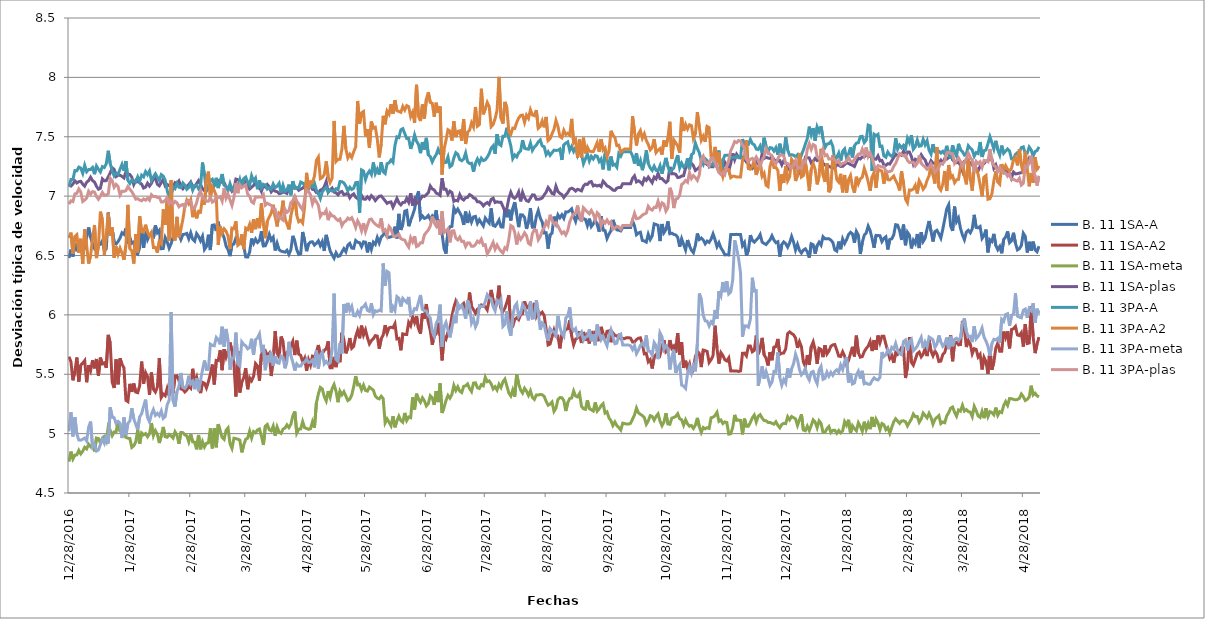
| Category | B. 11 1SA-A | B. 11 1SA-A2 | B. 11 1SA-meta | B. 11 1SA-plas | B. 11 3PA-A | B. 11 3PA-A2 | B. 11 3PA-meta | B. 11 3PA-plas |
|---|---|---|---|---|---|---|---|---|
| 28/12/2016 | 6.479 | 5.648 | 4.764 | 7.093 | 7.08 | 6.648 | 5.019 | 6.933 |
| 29/12/2016 | 6.55 | 5.605 | 4.849 | 7.085 | 7.141 | 6.693 | 5.18 | 6.96 |
| 30/12/2016 | 6.491 | 5.449 | 4.786 | 7.102 | 7.14 | 6.517 | 4.976 | 6.954 |
| 31/12/2016 | 6.603 | 5.524 | 4.819 | 7.129 | 7.215 | 6.66 | 5.138 | 7.018 |
| 01/01/2017 | 6.546 | 5.64 | 4.821 | 7.111 | 7.213 | 6.675 | 4.998 | 7.024 |
| 02/01/2017 | 6.548 | 5.438 | 4.859 | 7.122 | 7.244 | 6.522 | 4.946 | 7.061 |
| 03/01/2017 | 6.562 | 5.577 | 4.829 | 7.125 | 7.237 | 6.641 | 4.945 | 7.034 |
| 04/01/2017 | 6.517 | 5.594 | 4.851 | 7.101 | 7.192 | 6.432 | 4.953 | 6.955 |
| 05/01/2017 | 6.567 | 5.615 | 4.885 | 7.084 | 7.259 | 6.72 | 4.962 | 6.967 |
| 06/01/2017 | 6.652 | 5.433 | 4.871 | 7.117 | 7.205 | 6.584 | 4.937 | 6.983 |
| 07/01/2017 | 6.736 | 5.576 | 4.911 | 7.131 | 7.223 | 6.432 | 5.053 | 7.041 |
| 08/01/2017 | 6.655 | 5.531 | 4.89 | 7.159 | 7.224 | 6.5 | 5.101 | 7.017 |
| 09/01/2017 | 6.597 | 5.618 | 4.909 | 7.131 | 7.241 | 6.642 | 4.888 | 7.038 |
| 10/01/2017 | 6.559 | 5.55 | 4.85 | 7.119 | 7.185 | 6.757 | 4.907 | 7.034 |
| 11/01/2017 | 6.579 | 5.629 | 4.963 | 7.083 | 7.254 | 6.479 | 4.853 | 6.997 |
| 12/01/2017 | 6.588 | 5.488 | 4.959 | 7.058 | 7.226 | 6.579 | 4.863 | 6.973 |
| 13/01/2017 | 6.595 | 5.64 | 4.921 | 7.067 | 7.203 | 6.869 | 4.909 | 6.999 |
| 14/01/2017 | 6.624 | 5.587 | 4.961 | 7.145 | 7.249 | 6.801 | 4.954 | 7.032 |
| 15/01/2017 | 6.538 | 5.596 | 4.976 | 7.128 | 7.241 | 6.505 | 4.919 | 7.006 |
| 16/01/2017 | 6.558 | 5.554 | 4.939 | 7.131 | 7.272 | 6.674 | 4.984 | 7.01 |
| 17/01/2017 | 6.861 | 5.831 | 5.059 | 7.163 | 7.382 | 6.855 | 4.918 | 7.017 |
| 18/01/2017 | 6.676 | 5.761 | 5.028 | 7.194 | 7.273 | 6.665 | 5.221 | 7.151 |
| 19/01/2017 | 6.722 | 5.432 | 4.983 | 7.239 | 7.215 | 6.737 | 5.138 | 7.131 |
| 20/01/2017 | 6.613 | 5.385 | 5.015 | 7.225 | 7.171 | 6.481 | 5.134 | 7.075 |
| 21/01/2017 | 6.598 | 5.625 | 5.015 | 7.165 | 7.196 | 6.576 | 5.085 | 7.099 |
| 22/01/2017 | 6.617 | 5.415 | 5.102 | 7.176 | 7.184 | 6.511 | 5.103 | 7.081 |
| 23/01/2017 | 6.647 | 5.634 | 5.021 | 7.176 | 7.227 | 6.562 | 5.088 | 7.01 |
| 24/01/2017 | 6.691 | 5.584 | 5.022 | 7.166 | 7.267 | 6.52 | 4.963 | 7.04 |
| 25/01/2017 | 6.678 | 5.553 | 5 | 7.153 | 7.213 | 6.463 | 5.136 | 7.04 |
| 26/01/2017 | 6.728 | 5.28 | 4.968 | 7.206 | 7.295 | 6.587 | 4.986 | 7.047 |
| 27/01/2017 | 6.596 | 5.269 | 4.962 | 7.186 | 7.133 | 6.926 | 5.087 | 7.08 |
| 28/01/2017 | 6.653 | 5.419 | 4.959 | 7.182 | 7.107 | 6.558 | 5.106 | 7.058 |
| 29/01/2017 | 6.604 | 5.351 | 4.884 | 7.159 | 7.135 | 6.54 | 5.214 | 7.037 |
| 30/01/2017 | 6.614 | 5.422 | 4.898 | 7.098 | 7.121 | 6.432 | 5.125 | 7.009 |
| 31/01/2017 | 6.522 | 5.35 | 4.929 | 7.133 | 7.118 | 6.679 | 5.079 | 6.974 |
| 01/02/2017 | 6.511 | 5.345 | 5.029 | 7.122 | 7.162 | 6.525 | 5.032 | 6.979 |
| 02/02/2017 | 6.567 | 5.404 | 4.913 | 7.113 | 7.124 | 6.831 | 5.141 | 6.968 |
| 03/02/2017 | 6.728 | 5.606 | 5.006 | 7.101 | 7.177 | 6.7 | 5.167 | 6.961 |
| 04/02/2017 | 6.565 | 5.421 | 4.99 | 7.068 | 7.162 | 6.696 | 5.229 | 6.976 |
| 05/02/2017 | 6.706 | 5.514 | 5.001 | 7.076 | 7.207 | 6.759 | 5.287 | 6.966 |
| 06/02/2017 | 6.634 | 5.478 | 4.973 | 7.109 | 7.18 | 6.697 | 5.136 | 6.983 |
| 07/02/2017 | 6.669 | 5.327 | 4.999 | 7.085 | 7.212 | 6.665 | 5.1 | 6.966 |
| 08/02/2017 | 6.691 | 5.514 | 5.089 | 7.108 | 7.131 | 6.694 | 5.164 | 7.012 |
| 09/02/2017 | 6.645 | 5.375 | 4.983 | 7.145 | 7.162 | 6.567 | 5.203 | 6.996 |
| 10/02/2017 | 6.753 | 5.35 | 5.025 | 7.152 | 7.188 | 6.568 | 5.154 | 6.998 |
| 11/02/2017 | 6.692 | 5.391 | 4.994 | 7.1 | 7.159 | 6.523 | 5.171 | 6.988 |
| 12/02/2017 | 6.713 | 5.636 | 4.92 | 7.087 | 7.132 | 6.62 | 5.15 | 6.99 |
| 13/02/2017 | 6.557 | 5.305 | 4.982 | 7.113 | 7.181 | 6.599 | 5.192 | 6.951 |
| 14/02/2017 | 6.559 | 5.333 | 5.056 | 7.143 | 7.169 | 6.889 | 5.129 | 6.951 |
| 15/02/2017 | 6.651 | 5.319 | 4.974 | 7.086 | 7.133 | 6.757 | 5.144 | 6.965 |
| 16/02/2017 | 6.615 | 5.38 | 4.969 | 7.098 | 7.048 | 6.971 | 5.243 | 6.988 |
| 17/02/2017 | 6.562 | 5.319 | 4.993 | 7.089 | 6.983 | 6.622 | 5.28 | 6.936 |
| 18/02/2017 | 6.6 | 5.41 | 4.981 | 7.091 | 6.984 | 7.135 | 6.025 | 6.954 |
| 19/02/2017 | 6.656 | 5.34 | 4.963 | 7.066 | 7.08 | 6.664 | 5.278 | 6.935 |
| 20/02/2017 | 6.694 | 5.486 | 5.016 | 7.114 | 7.064 | 6.626 | 5.227 | 6.956 |
| 21/02/2017 | 6.76 | 5.487 | 4.987 | 7.107 | 7.107 | 6.825 | 5.356 | 6.944 |
| 22/02/2017 | 6.677 | 5.447 | 4.914 | 7.128 | 7.075 | 6.653 | 5.397 | 6.91 |
| 23/02/2017 | 6.634 | 5.376 | 5.009 | 7.083 | 7.071 | 6.721 | 5.511 | 6.924 |
| 24/02/2017 | 6.677 | 5.372 | 5.008 | 7.062 | 7.111 | 6.803 | 5.39 | 6.929 |
| 25/02/2017 | 6.679 | 5.351 | 4.99 | 7.084 | 7.092 | 6.91 | 5.381 | 6.904 |
| 26/02/2017 | 6.686 | 5.367 | 4.982 | 7.082 | 7.057 | 6.966 | 5.404 | 6.955 |
| 27/02/2017 | 6.641 | 5.397 | 4.931 | 7.097 | 7.072 | 6.935 | 5.488 | 6.965 |
| 28/02/2017 | 6.691 | 5.382 | 4.995 | 7.119 | 7.109 | 6.97 | 5.418 | 6.956 |
| 01/03/2017 | 6.637 | 5.546 | 4.931 | 7.083 | 7.05 | 6.823 | 5.44 | 6.895 |
| 02/03/2017 | 6.62 | 5.432 | 4.928 | 7.078 | 7.09 | 6.878 | 5.374 | 6.901 |
| 03/03/2017 | 6.685 | 5.475 | 4.867 | 7.106 | 7.094 | 6.812 | 5.467 | 6.944 |
| 04/03/2017 | 6.661 | 5.391 | 4.989 | 7.131 | 7.061 | 6.872 | 5.358 | 7.009 |
| 05/03/2017 | 6.624 | 5.341 | 4.868 | 7.096 | 7.082 | 6.865 | 5.448 | 7.043 |
| 06/03/2017 | 6.662 | 5.432 | 4.932 | 7.064 | 7.283 | 6.995 | 5.537 | 6.982 |
| 07/03/2017 | 6.551 | 5.424 | 4.887 | 7.045 | 7.179 | 6.929 | 5.616 | 6.978 |
| 08/03/2017 | 6.575 | 5.385 | 4.919 | 7.082 | 7.042 | 7.145 | 5.54 | 6.957 |
| 09/03/2017 | 6.675 | 5.437 | 4.922 | 7.085 | 7.069 | 7.206 | 5.54 | 6.957 |
| 10/03/2017 | 6.546 | 5.502 | 5.044 | 7.094 | 7.133 | 6.99 | 5.754 | 6.991 |
| 11/03/2017 | 6.755 | 5.582 | 4.876 | 7.071 | 7.143 | 7.077 | 5.743 | 6.949 |
| 12/03/2017 | 6.758 | 5.414 | 5.046 | 7.089 | 7.096 | 7.046 | 5.74 | 6.959 |
| 13/03/2017 | 6.707 | 5.617 | 4.885 | 7.12 | 7.154 | 7.002 | 5.81 | 6.995 |
| 14/03/2017 | 6.785 | 5.615 | 5.08 | 7.132 | 7.068 | 6.589 | 5.792 | 6.988 |
| 15/03/2017 | 6.681 | 5.702 | 5.023 | 7.123 | 7.127 | 6.746 | 5.752 | 6.996 |
| 16/03/2017 | 6.693 | 5.534 | 4.968 | 7.116 | 7.186 | 6.686 | 5.9 | 6.958 |
| 17/03/2017 | 6.65 | 5.711 | 4.951 | 7.115 | 7.093 | 6.725 | 5.731 | 7.068 |
| 18/03/2017 | 6.58 | 5.645 | 5.028 | 7.079 | 7.079 | 6.705 | 5.882 | 6.981 |
| 19/03/2017 | 6.548 | 5.696 | 5.048 | 7.073 | 7.045 | 6.664 | 5.78 | 7.015 |
| 20/03/2017 | 6.495 | 5.767 | 4.915 | 7.071 | 7.105 | 6.556 | 5.538 | 6.967 |
| 21/03/2017 | 6.593 | 5.699 | 4.876 | 7.04 | 7.055 | 6.731 | 5.631 | 6.921 |
| 22/03/2017 | 6.597 | 5.585 | 4.961 | 7.057 | 7.079 | 6.726 | 5.641 | 6.989 |
| 23/03/2017 | 6.648 | 5.313 | 4.958 | 7.144 | 7.095 | 6.788 | 5.851 | 7.111 |
| 24/03/2017 | 6.637 | 5.693 | 4.953 | 7.138 | 7.087 | 6.586 | 5.588 | 7.025 |
| 25/03/2017 | 6.608 | 5.347 | 4.945 | 7.13 | 7.14 | 6.6 | 5.57 | 7.095 |
| 26/03/2017 | 6.607 | 5.433 | 4.842 | 7.128 | 7.07 | 6.678 | 5.773 | 7.071 |
| 27/03/2017 | 6.579 | 5.471 | 4.904 | 7.109 | 7.147 | 6.553 | 5.75 | 7.083 |
| 28/03/2017 | 6.489 | 5.552 | 4.953 | 7.125 | 7.161 | 6.73 | 5.74 | 7.094 |
| 29/03/2017 | 6.487 | 5.374 | 4.962 | 7.089 | 7.12 | 6.718 | 5.714 | 7.016 |
| 30/03/2017 | 6.528 | 5.469 | 5.021 | 7.06 | 7.092 | 6.762 | 5.725 | 7 |
| 31/03/2017 | 6.643 | 5.446 | 4.963 | 7.075 | 7.172 | 6.691 | 5.799 | 6.953 |
| 01/04/2017 | 6.601 | 5.484 | 5.018 | 7.09 | 7.126 | 6.806 | 5.663 | 6.94 |
| 02/04/2017 | 6.638 | 5.59 | 5.007 | 7.111 | 7.152 | 6.722 | 5.79 | 6.994 |
| 03/04/2017 | 6.61 | 5.57 | 5.031 | 7.08 | 7.058 | 6.814 | 5.806 | 6.991 |
| 04/04/2017 | 6.625 | 5.446 | 5.039 | 7.076 | 7.133 | 6.731 | 5.84 | 6.993 |
| 05/04/2017 | 6.704 | 5.669 | 4.98 | 7.04 | 7.07 | 6.94 | 5.713 | 6.992 |
| 06/04/2017 | 6.58 | 5.688 | 4.904 | 7.094 | 7.096 | 6.762 | 5.747 | 7.012 |
| 07/04/2017 | 6.582 | 5.697 | 5.063 | 7.076 | 7.096 | 6.645 | 5.534 | 6.924 |
| 08/04/2017 | 6.621 | 5.656 | 5.077 | 7.098 | 7.059 | 6.788 | 5.657 | 6.94 |
| 09/04/2017 | 6.677 | 5.677 | 5.032 | 7.078 | 7.07 | 6.824 | 5.6 | 6.93 |
| 10/04/2017 | 6.63 | 5.485 | 5.023 | 7.035 | 7.058 | 6.857 | 5.689 | 6.922 |
| 11/04/2017 | 6.654 | 5.645 | 5.064 | 7.055 | 7.103 | 6.927 | 5.572 | 6.895 |
| 12/04/2017 | 6.542 | 5.863 | 4.982 | 7.042 | 7.071 | 6.827 | 5.651 | 6.89 |
| 13/04/2017 | 6.604 | 5.678 | 5.056 | 7.037 | 7.084 | 6.745 | 5.598 | 6.817 |
| 14/04/2017 | 6.549 | 5.646 | 5.014 | 7.021 | 7.108 | 6.857 | 5.593 | 6.834 |
| 15/04/2017 | 6.537 | 5.818 | 5.003 | 7.024 | 7.027 | 6.845 | 5.654 | 6.811 |
| 16/04/2017 | 6.533 | 5.776 | 5.037 | 7.034 | 7.091 | 6.962 | 5.642 | 6.798 |
| 17/04/2017 | 6.528 | 5.613 | 5.047 | 7.03 | 7.039 | 6.81 | 5.55 | 6.889 |
| 18/04/2017 | 6.544 | 5.683 | 5.074 | 7.023 | 7.05 | 6.767 | 5.609 | 6.864 |
| 19/04/2017 | 6.509 | 5.694 | 5.051 | 7.07 | 7.097 | 6.72 | 5.774 | 6.877 |
| 20/04/2017 | 6.548 | 5.74 | 5.078 | 7.066 | 7.007 | 6.835 | 5.658 | 6.946 |
| 21/04/2017 | 6.665 | 5.778 | 5.149 | 7.097 | 7.126 | 6.906 | 5.601 | 6.963 |
| 22/04/2017 | 6.62 | 5.662 | 5.187 | 7.066 | 7.067 | 7.004 | 5.531 | 6.999 |
| 23/04/2017 | 6.549 | 5.783 | 5.004 | 7.07 | 7.073 | 6.839 | 5.587 | 6.958 |
| 24/04/2017 | 6.509 | 5.67 | 5.037 | 7.049 | 7.067 | 6.784 | 5.568 | 6.936 |
| 25/04/2017 | 6.515 | 5.659 | 5.039 | 7.06 | 7.119 | 6.796 | 5.569 | 6.907 |
| 26/04/2017 | 6.698 | 5.604 | 5.101 | 7.068 | 7.111 | 6.773 | 5.596 | 6.884 |
| 27/04/2017 | 6.626 | 5.636 | 5.05 | 7.084 | 7.09 | 6.911 | 5.601 | 6.975 |
| 28/04/2017 | 6.537 | 5.53 | 5.044 | 7.125 | 7.045 | 7.196 | 5.627 | 7.052 |
| 29/04/2017 | 6.598 | 5.622 | 5.036 | 7.114 | 7.06 | 7.064 | 5.599 | 7.039 |
| 30/04/2017 | 6.614 | 5.576 | 5.041 | 7.089 | 7.091 | 7.122 | 5.602 | 7.011 |
| 01/05/2017 | 6.615 | 5.652 | 5.1 | 7.057 | 7.078 | 7.116 | 5.619 | 6.934 |
| 02/05/2017 | 6.588 | 5.646 | 5.051 | 7.054 | 7.109 | 7.166 | 5.559 | 6.978 |
| 03/05/2017 | 6.603 | 5.686 | 5.257 | 7.03 | 7.05 | 7.302 | 5.7 | 6.952 |
| 04/05/2017 | 6.624 | 5.746 | 5.334 | 7.024 | 7.024 | 7.33 | 5.547 | 6.924 |
| 05/05/2017 | 6.583 | 5.653 | 5.389 | 7.051 | 6.98 | 7.147 | 5.659 | 6.829 |
| 06/05/2017 | 6.618 | 5.673 | 5.377 | 7.057 | 7.035 | 7.157 | 5.687 | 6.856 |
| 07/05/2017 | 6.538 | 5.701 | 5.312 | 7.079 | 7.057 | 7.181 | 5.588 | 6.851 |
| 08/05/2017 | 6.674 | 5.714 | 5.276 | 7.124 | 7.074 | 7.293 | 5.608 | 6.88 |
| 09/05/2017 | 6.603 | 5.777 | 5.358 | 7.032 | 7.034 | 7.164 | 5.586 | 6.798 |
| 10/05/2017 | 6.54 | 5.554 | 5.307 | 7.053 | 7.051 | 7.114 | 5.596 | 6.855 |
| 11/05/2017 | 6.506 | 5.555 | 5.379 | 7.068 | 7.043 | 7.149 | 5.702 | 6.835 |
| 12/05/2017 | 6.477 | 5.647 | 5.413 | 7.034 | 7.043 | 7.633 | 6.179 | 6.829 |
| 13/05/2017 | 6.523 | 5.56 | 5.356 | 7.029 | 7.063 | 7.291 | 5.625 | 6.809 |
| 14/05/2017 | 6.493 | 5.642 | 5.265 | 7.011 | 7.054 | 7.309 | 5.609 | 6.795 |
| 15/05/2017 | 6.498 | 5.602 | 5.357 | 7.033 | 7.122 | 7.311 | 5.762 | 6.807 |
| 16/05/2017 | 6.53 | 5.85 | 5.327 | 7.039 | 7.122 | 7.396 | 5.675 | 6.751 |
| 17/05/2017 | 6.558 | 5.789 | 5.353 | 7.013 | 7.111 | 7.592 | 6.092 | 6.781 |
| 18/05/2017 | 6.531 | 5.676 | 5.316 | 7.016 | 7.084 | 7.398 | 6.018 | 6.79 |
| 19/05/2017 | 6.587 | 5.721 | 5.279 | 7.027 | 7.044 | 7.322 | 6.1 | 6.815 |
| 20/05/2017 | 6.602 | 5.805 | 5.29 | 6.985 | 7.075 | 7.352 | 6.038 | 6.804 |
| 21/05/2017 | 6.562 | 5.719 | 5.325 | 7.008 | 7.056 | 7.325 | 6.073 | 6.818 |
| 22/05/2017 | 6.561 | 5.736 | 5.396 | 7.019 | 7.066 | 7.374 | 5.994 | 6.783 |
| 23/05/2017 | 6.626 | 5.817 | 5.484 | 6.991 | 7.114 | 7.414 | 5.992 | 6.736 |
| 24/05/2017 | 6.612 | 5.869 | 5.41 | 6.979 | 7.115 | 7.801 | 6.03 | 6.792 |
| 25/05/2017 | 6.608 | 5.803 | 5.415 | 6.989 | 6.859 | 7.61 | 5.995 | 6.762 |
| 26/05/2017 | 6.574 | 5.909 | 5.369 | 7.006 | 7.221 | 7.702 | 6.06 | 6.708 |
| 27/05/2017 | 6.615 | 5.83 | 5.408 | 6.975 | 7.211 | 7.713 | 6.068 | 6.772 |
| 28/05/2017 | 6.612 | 5.874 | 5.363 | 6.974 | 7.139 | 7.503 | 6.091 | 6.702 |
| 29/05/2017 | 6.526 | 5.808 | 5.358 | 6.994 | 7.187 | 7.564 | 6.037 | 6.754 |
| 30/05/2017 | 6.611 | 5.756 | 5.392 | 6.976 | 7.211 | 7.406 | 6.029 | 6.802 |
| 31/05/2017 | 6.551 | 5.784 | 5.379 | 7.005 | 7.182 | 7.628 | 6.097 | 6.807 |
| 01/06/2017 | 6.612 | 5.799 | 5.366 | 6.988 | 7.284 | 7.572 | 6.001 | 6.781 |
| 02/06/2017 | 6.594 | 5.825 | 5.316 | 6.962 | 7.19 | 7.58 | 6.035 | 6.764 |
| 03/06/2017 | 6.651 | 5.822 | 5.299 | 6.982 | 7.227 | 7.481 | 6.028 | 6.752 |
| 04/06/2017 | 6.606 | 5.715 | 5.293 | 6.999 | 7.182 | 7.326 | 6.039 | 6.742 |
| 05/06/2017 | 6.655 | 5.8 | 5.315 | 7.002 | 7.286 | 7.44 | 6.034 | 6.813 |
| 06/06/2017 | 6.673 | 5.829 | 5.295 | 6.982 | 7.206 | 7.676 | 6.433 | 6.704 |
| 07/06/2017 | 6.702 | 5.914 | 5.091 | 6.961 | 7.19 | 7.605 | 6.245 | 6.718 |
| 08/06/2017 | 6.658 | 5.846 | 5.124 | 6.939 | 7.273 | 7.716 | 6.366 | 6.669 |
| 09/06/2017 | 6.653 | 5.891 | 5.096 | 6.948 | 7.281 | 7.69 | 6.355 | 6.745 |
| 10/06/2017 | 6.658 | 5.896 | 5.066 | 6.951 | 7.305 | 7.775 | 6.02 | 6.725 |
| 11/06/2017 | 6.664 | 5.892 | 5.147 | 6.907 | 7.285 | 7.692 | 6.069 | 6.67 |
| 12/06/2017 | 6.743 | 5.925 | 5.053 | 6.942 | 7.426 | 7.809 | 6.036 | 6.659 |
| 13/06/2017 | 6.644 | 5.798 | 5.108 | 6.981 | 7.499 | 7.719 | 6.154 | 6.667 |
| 14/06/2017 | 6.85 | 5.802 | 5.147 | 6.944 | 7.493 | 7.713 | 6.14 | 6.679 |
| 15/06/2017 | 6.715 | 5.702 | 5.11 | 6.926 | 7.558 | 7.706 | 6.07 | 6.642 |
| 16/06/2017 | 6.763 | 5.84 | 5.096 | 6.947 | 7.568 | 7.756 | 6.139 | 6.634 |
| 17/06/2017 | 6.873 | 5.836 | 5.174 | 6.948 | 7.527 | 7.725 | 6.121 | 6.629 |
| 18/06/2017 | 6.879 | 5.836 | 5.111 | 6.982 | 7.485 | 7.762 | 6.104 | 6.595 |
| 19/06/2017 | 6.747 | 5.937 | 5.14 | 6.948 | 7.485 | 7.753 | 6.151 | 6.571 |
| 20/06/2017 | 6.796 | 5.908 | 5.134 | 7.025 | 7.398 | 7.669 | 5.999 | 6.65 |
| 21/06/2017 | 6.839 | 5.983 | 5.306 | 6.921 | 7.446 | 7.706 | 6.014 | 6.616 |
| 22/06/2017 | 6.891 | 5.936 | 5.203 | 6.974 | 7.515 | 7.616 | 6.053 | 6.663 |
| 23/06/2017 | 6.992 | 5.99 | 5.336 | 6.938 | 7.462 | 7.938 | 6.046 | 6.575 |
| 24/06/2017 | 7.041 | 5.884 | 5.289 | 6.953 | 7.435 | 7.672 | 6.105 | 6.584 |
| 25/06/2017 | 6.812 | 5.842 | 5.263 | 6.975 | 7.362 | 7.632 | 6.168 | 6.607 |
| 26/06/2017 | 6.833 | 6.012 | 5.302 | 7.002 | 7.455 | 7.772 | 6.045 | 6.607 |
| 27/06/2017 | 6.812 | 5.968 | 5.277 | 6.997 | 7.393 | 7.652 | 6.035 | 6.673 |
| 28/06/2017 | 6.819 | 6.091 | 5.233 | 7.013 | 7.491 | 7.816 | 6.033 | 6.695 |
| 29/06/2017 | 6.837 | 5.938 | 5.253 | 7.028 | 7.348 | 7.874 | 5.994 | 6.715 |
| 30/06/2017 | 6.804 | 5.866 | 5.319 | 7.085 | 7.333 | 7.788 | 5.974 | 6.748 |
| 01/07/2017 | 6.833 | 5.749 | 5.302 | 7.061 | 7.289 | 7.782 | 5.86 | 6.829 |
| 02/07/2017 | 6.81 | 5.822 | 5.242 | 7.052 | 7.324 | 7.668 | 5.821 | 6.776 |
| 03/07/2017 | 6.881 | 5.841 | 5.358 | 7.026 | 7.349 | 7.787 | 5.928 | 6.748 |
| 04/07/2017 | 6.736 | 5.933 | 5.265 | 7.019 | 7.395 | 7.702 | 5.963 | 6.796 |
| 05/07/2017 | 6.8 | 5.824 | 5.423 | 7.006 | 7.358 | 7.755 | 6.087 | 6.675 |
| 06/07/2017 | 6.682 | 5.617 | 5.174 | 7.151 | 7.358 | 7.182 | 5.733 | 6.872 |
| 07/07/2017 | 6.559 | 5.82 | 5.221 | 7.058 | 7.283 | 7.394 | 5.901 | 6.693 |
| 08/07/2017 | 6.516 | 5.796 | 5.278 | 7.058 | 7.284 | 7.471 | 5.937 | 6.707 |
| 09/07/2017 | 6.709 | 5.856 | 5.321 | 7.016 | 7.33 | 7.559 | 5.874 | 6.724 |
| 10/07/2017 | 6.742 | 5.881 | 5.299 | 7.042 | 7.247 | 7.547 | 5.811 | 6.611 |
| 11/07/2017 | 6.745 | 5.988 | 5.329 | 7.03 | 7.259 | 7.468 | 5.893 | 6.707 |
| 12/07/2017 | 6.9 | 6.064 | 5.406 | 6.957 | 7.322 | 7.629 | 5.977 | 6.707 |
| 13/07/2017 | 6.866 | 6.116 | 5.363 | 6.965 | 7.366 | 7.496 | 5.93 | 6.646 |
| 14/07/2017 | 6.891 | 6.08 | 5.395 | 6.96 | 7.353 | 7.545 | 6.094 | 6.631 |
| 15/07/2017 | 6.86 | 6.062 | 5.358 | 7.012 | 7.308 | 7.55 | 6.058 | 6.655 |
| 16/07/2017 | 6.829 | 6.08 | 5.346 | 6.979 | 7.298 | 7.468 | 6.079 | 6.619 |
| 17/07/2017 | 6.757 | 6.097 | 5.398 | 6.967 | 7.312 | 7.647 | 6.039 | 6.619 |
| 18/07/2017 | 6.87 | 6.038 | 5.403 | 6.986 | 7.363 | 7.439 | 5.968 | 6.576 |
| 19/07/2017 | 6.774 | 6.029 | 5.418 | 6.99 | 7.288 | 7.539 | 6.121 | 6.606 |
| 20/07/2017 | 6.84 | 6.188 | 5.379 | 7.013 | 7.275 | 7.555 | 6.078 | 6.606 |
| 21/07/2017 | 6.782 | 6.072 | 5.354 | 7.004 | 7.277 | 7.617 | 5.931 | 6.578 |
| 22/07/2017 | 6.825 | 6.045 | 5.425 | 6.985 | 7.205 | 7.581 | 5.969 | 6.577 |
| 23/07/2017 | 6.83 | 6.014 | 5.428 | 6.979 | 7.277 | 7.751 | 5.899 | 6.592 |
| 24/07/2017 | 6.77 | 6.048 | 5.386 | 6.952 | 7.313 | 7.589 | 5.935 | 6.621 |
| 25/07/2017 | 6.801 | 6.058 | 5.38 | 6.952 | 7.277 | 7.602 | 6.077 | 6.609 |
| 26/07/2017 | 6.774 | 6.084 | 5.412 | 6.941 | 7.319 | 7.904 | 6.071 | 6.638 |
| 27/07/2017 | 6.749 | 6.077 | 5.403 | 6.918 | 7.299 | 7.689 | 6.07 | 6.586 |
| 28/07/2017 | 6.815 | 6.068 | 5.475 | 6.935 | 7.306 | 7.735 | 6.112 | 6.591 |
| 29/07/2017 | 6.792 | 6.042 | 5.437 | 6.946 | 7.328 | 7.789 | 6.17 | 6.513 |
| 30/07/2017 | 6.773 | 6.126 | 5.444 | 6.93 | 7.358 | 7.753 | 6.144 | 6.539 |
| 31/07/2017 | 6.897 | 6.21 | 5.419 | 6.973 | 7.404 | 7.585 | 6.136 | 6.575 |
| 01/08/2017 | 6.753 | 6.124 | 5.376 | 6.983 | 7.423 | 7.603 | 6.068 | 6.611 |
| 02/08/2017 | 6.746 | 6.049 | 5.395 | 6.946 | 7.357 | 7.652 | 6.034 | 6.553 |
| 03/08/2017 | 6.768 | 6.119 | 5.367 | 6.953 | 7.521 | 7.722 | 6.12 | 6.589 |
| 04/08/2017 | 6.798 | 6.246 | 5.416 | 6.948 | 7.438 | 8.004 | 6.099 | 6.559 |
| 05/08/2017 | 6.741 | 6.054 | 5.388 | 6.949 | 7.426 | 7.656 | 6.131 | 6.536 |
| 06/08/2017 | 6.74 | 6.027 | 5.437 | 6.912 | 7.504 | 7.611 | 5.903 | 6.521 |
| 07/08/2017 | 6.898 | 6.057 | 5.459 | 6.873 | 7.504 | 7.793 | 5.92 | 6.566 |
| 08/08/2017 | 6.823 | 6.106 | 5.401 | 6.896 | 7.576 | 7.745 | 6.032 | 6.553 |
| 09/08/2017 | 6.886 | 6.165 | 5.341 | 6.981 | 7.488 | 7.539 | 5.888 | 6.637 |
| 10/08/2017 | 6.795 | 5.878 | 5.317 | 7.032 | 7.423 | 7.519 | 5.824 | 6.752 |
| 11/08/2017 | 6.897 | 5.904 | 5.368 | 6.992 | 7.316 | 7.573 | 5.994 | 6.742 |
| 12/08/2017 | 6.95 | 5.962 | 5.311 | 6.981 | 7.346 | 7.57 | 6.072 | 6.695 |
| 13/08/2017 | 6.847 | 5.975 | 5.5 | 6.998 | 7.329 | 7.621 | 6.096 | 6.593 |
| 14/08/2017 | 6.739 | 5.96 | 5.42 | 7.036 | 7.365 | 7.658 | 5.987 | 6.672 |
| 15/08/2017 | 6.843 | 6.003 | 5.367 | 6.956 | 7.381 | 7.679 | 6.011 | 6.635 |
| 16/08/2017 | 6.841 | 6.01 | 5.342 | 7.032 | 7.471 | 7.682 | 6.089 | 6.658 |
| 17/08/2017 | 6.82 | 6.114 | 5.382 | 6.988 | 7.403 | 7.621 | 6.062 | 6.691 |
| 18/08/2017 | 6.724 | 6.056 | 5.358 | 6.962 | 7.397 | 7.682 | 6.02 | 6.666 |
| 19/08/2017 | 6.786 | 6.077 | 5.322 | 6.955 | 7.395 | 7.655 | 5.954 | 6.603 |
| 20/08/2017 | 6.9 | 6.093 | 5.361 | 6.983 | 7.447 | 7.727 | 6.115 | 6.591 |
| 21/08/2017 | 6.738 | 5.986 | 5.305 | 7.01 | 7.385 | 7.683 | 5.971 | 6.684 |
| 22/08/2017 | 6.732 | 6.101 | 5.288 | 7.009 | 7.414 | 7.678 | 5.975 | 6.719 |
| 23/08/2017 | 6.829 | 5.99 | 5.325 | 6.973 | 7.43 | 7.725 | 6.125 | 6.711 |
| 24/08/2017 | 6.878 | 6.028 | 5.326 | 6.973 | 7.458 | 7.572 | 6.021 | 6.632 |
| 25/08/2017 | 6.816 | 6.007 | 5.33 | 6.977 | 7.473 | 7.587 | 5.874 | 6.658 |
| 26/08/2017 | 6.782 | 6.023 | 5.327 | 6.984 | 7.422 | 7.634 | 5.932 | 6.707 |
| 27/08/2017 | 6.69 | 5.994 | 5.314 | 7.01 | 7.417 | 7.579 | 5.917 | 6.733 |
| 28/08/2017 | 6.692 | 5.881 | 5.273 | 7.033 | 7.349 | 7.667 | 5.837 | 6.785 |
| 29/08/2017 | 6.558 | 5.747 | 5.239 | 7.073 | 7.374 | 7.468 | 5.783 | 6.753 |
| 30/08/2017 | 6.674 | 5.754 | 5.249 | 7.051 | 7.343 | 7.483 | 5.886 | 6.843 |
| 31/08/2017 | 6.688 | 5.813 | 5.266 | 7.022 | 7.366 | 7.525 | 5.865 | 6.796 |
| 01/09/2017 | 6.827 | 5.872 | 5.188 | 7.017 | 7.387 | 7.564 | 5.856 | 6.766 |
| 02/09/2017 | 6.774 | 5.82 | 5.214 | 7.084 | 7.385 | 7.638 | 5.827 | 6.777 |
| 03/09/2017 | 6.843 | 5.822 | 5.288 | 7.038 | 7.386 | 7.587 | 5.991 | 6.749 |
| 04/09/2017 | 6.818 | 5.718 | 5.303 | 7.023 | 7.397 | 7.503 | 5.896 | 6.716 |
| 05/09/2017 | 6.843 | 5.835 | 5.303 | 7.013 | 7.305 | 7.491 | 5.841 | 6.685 |
| 06/09/2017 | 6.813 | 5.848 | 5.278 | 6.988 | 7.432 | 7.554 | 5.819 | 6.7 |
| 07/09/2017 | 6.867 | 5.879 | 5.19 | 7.011 | 7.446 | 7.519 | 5.974 | 6.673 |
| 08/09/2017 | 6.866 | 5.883 | 5.26 | 7.03 | 7.457 | 7.53 | 5.989 | 6.709 |
| 09/09/2017 | 6.878 | 5.955 | 5.296 | 7.059 | 7.384 | 7.514 | 6.064 | 6.783 |
| 10/09/2017 | 6.893 | 5.821 | 5.3 | 7.067 | 7.418 | 7.65 | 5.896 | 6.822 |
| 11/09/2017 | 6.83 | 5.748 | 5.358 | 7.059 | 7.376 | 7.449 | 5.867 | 6.849 |
| 12/09/2017 | 6.787 | 5.795 | 5.316 | 7.043 | 7.407 | 7.474 | 5.885 | 6.856 |
| 13/09/2017 | 6.853 | 5.807 | 5.309 | 7.057 | 7.345 | 7.325 | 5.82 | 6.92 |
| 14/09/2017 | 6.813 | 5.863 | 5.338 | 7.052 | 7.391 | 7.48 | 5.834 | 6.84 |
| 15/09/2017 | 6.832 | 5.764 | 5.23 | 7.044 | 7.355 | 7.323 | 5.856 | 6.783 |
| 16/09/2017 | 6.81 | 5.856 | 5.21 | 7.084 | 7.273 | 7.492 | 5.785 | 6.902 |
| 17/09/2017 | 6.804 | 5.782 | 5.205 | 7.101 | 7.314 | 7.36 | 5.813 | 6.884 |
| 18/09/2017 | 6.752 | 5.849 | 5.282 | 7.098 | 7.354 | 7.412 | 5.818 | 6.868 |
| 19/09/2017 | 6.811 | 5.76 | 5.209 | 7.118 | 7.295 | 7.379 | 5.879 | 6.852 |
| 20/09/2017 | 6.743 | 5.865 | 5.201 | 7.123 | 7.335 | 7.376 | 5.778 | 6.88 |
| 21/09/2017 | 6.765 | 5.783 | 5.19 | 7.086 | 7.312 | 7.374 | 5.835 | 6.851 |
| 22/09/2017 | 6.801 | 5.865 | 5.263 | 7.093 | 7.341 | 7.412 | 5.744 | 6.799 |
| 23/09/2017 | 6.761 | 5.788 | 5.189 | 7.085 | 7.336 | 7.451 | 5.918 | 6.861 |
| 24/09/2017 | 6.701 | 5.79 | 5.208 | 7.092 | 7.291 | 7.373 | 5.85 | 6.844 |
| 25/09/2017 | 6.831 | 5.9 | 5.235 | 7.08 | 7.313 | 7.481 | 5.791 | 6.752 |
| 26/09/2017 | 6.713 | 5.837 | 5.252 | 7.126 | 7.225 | 7.389 | 5.819 | 6.792 |
| 27/09/2017 | 6.709 | 5.804 | 5.173 | 7.108 | 7.355 | 7.407 | 5.778 | 6.772 |
| 28/09/2017 | 6.643 | 5.862 | 5.183 | 7.086 | 7.32 | 7.331 | 5.739 | 6.799 |
| 29/09/2017 | 6.68 | 5.865 | 5.132 | 7.079 | 7.217 | 7.376 | 5.825 | 6.77 |
| 30/09/2017 | 6.708 | 5.77 | 5.109 | 7.066 | 7.333 | 7.55 | 5.875 | 6.785 |
| 01/10/2017 | 6.8 | 5.848 | 5.068 | 7.051 | 7.26 | 7.514 | 5.818 | 6.72 |
| 02/10/2017 | 6.751 | 5.827 | 5.098 | 7.048 | 7.269 | 7.494 | 5.757 | 6.731 |
| 03/10/2017 | 6.716 | 5.822 | 5.068 | 7.067 | 7.244 | 7.425 | 5.761 | 6.748 |
| 04/10/2017 | 6.713 | 5.83 | 5.052 | 7.073 | 7.357 | 7.429 | 5.827 | 6.741 |
| 05/10/2017 | 6.707 | 5.799 | 5.031 | 7.072 | 7.336 | 7.371 | 5.838 | 6.721 |
| 06/10/2017 | 6.736 | 5.803 | 5.088 | 7.105 | 7.375 | 7.385 | 5.746 | 6.753 |
| 07/10/2017 | 6.736 | 5.8 | 5.084 | 7.105 | 7.375 | 7.398 | 5.746 | 6.753 |
| 08/10/2017 | 6.736 | 5.808 | 5.08 | 7.105 | 7.375 | 7.398 | 5.746 | 6.753 |
| 09/10/2017 | 6.736 | 5.808 | 5.08 | 7.105 | 7.375 | 7.398 | 5.746 | 6.753 |
| 10/10/2017 | 6.736 | 5.804 | 5.087 | 7.105 | 7.375 | 7.398 | 5.739 | 6.753 |
| 11/10/2017 | 6.794 | 5.772 | 5.122 | 7.15 | 7.339 | 7.674 | 5.708 | 6.798 |
| 12/10/2017 | 6.749 | 5.772 | 5.158 | 7.171 | 7.275 | 7.54 | 5.742 | 6.855 |
| 13/10/2017 | 6.675 | 5.792 | 5.215 | 7.12 | 7.362 | 7.426 | 5.673 | 6.81 |
| 14/10/2017 | 6.69 | 5.803 | 5.176 | 7.129 | 7.255 | 7.524 | 5.703 | 6.812 |
| 15/10/2017 | 6.696 | 5.807 | 5.163 | 7.119 | 7.3 | 7.553 | 5.744 | 6.823 |
| 16/10/2017 | 6.626 | 5.755 | 5.152 | 7.1 | 7.218 | 7.487 | 5.761 | 6.841 |
| 17/10/2017 | 6.622 | 5.672 | 5.135 | 7.149 | 7.286 | 7.525 | 5.738 | 6.849 |
| 18/10/2017 | 6.612 | 5.676 | 5.079 | 7.133 | 7.386 | 7.469 | 5.828 | 6.857 |
| 19/10/2017 | 6.679 | 5.605 | 5.107 | 7.16 | 7.275 | 7.435 | 5.696 | 6.914 |
| 20/10/2017 | 6.635 | 5.623 | 5.152 | 7.136 | 7.238 | 7.389 | 5.692 | 6.891 |
| 21/10/2017 | 6.665 | 5.549 | 5.145 | 7.113 | 7.217 | 7.408 | 5.661 | 6.882 |
| 22/10/2017 | 6.766 | 5.645 | 5.113 | 7.16 | 7.253 | 7.48 | 5.767 | 6.906 |
| 23/10/2017 | 6.761 | 5.667 | 5.145 | 7.145 | 7.217 | 7.368 | 5.741 | 6.904 |
| 24/10/2017 | 6.754 | 5.685 | 5.166 | 7.192 | 7.215 | 7.388 | 5.627 | 6.957 |
| 25/10/2017 | 6.621 | 5.662 | 5.105 | 7.147 | 7.256 | 7.401 | 5.848 | 6.898 |
| 26/10/2017 | 6.765 | 5.729 | 5.067 | 7.148 | 7.189 | 7.35 | 5.815 | 6.943 |
| 27/10/2017 | 6.692 | 5.787 | 5.098 | 7.129 | 7.258 | 7.469 | 5.71 | 6.932 |
| 28/10/2017 | 6.718 | 5.687 | 5.171 | 7.115 | 7.322 | 7.416 | 5.738 | 6.874 |
| 29/10/2017 | 6.787 | 5.7 | 5.081 | 7.129 | 7.251 | 7.492 | 5.719 | 6.902 |
| 30/10/2017 | 6.683 | 5.788 | 5.079 | 7.245 | 7.203 | 7.626 | 5.54 | 7.07 |
| 31/10/2017 | 6.688 | 5.719 | 5.131 | 7.188 | 7.219 | 7.314 | 5.645 | 7.026 |
| 01/11/2017 | 6.678 | 5.737 | 5.136 | 7.19 | 7.237 | 7.473 | 5.706 | 6.899 |
| 02/11/2017 | 6.673 | 5.682 | 5.145 | 7.184 | 7.299 | 7.449 | 5.511 | 6.975 |
| 03/11/2017 | 6.653 | 5.846 | 5.168 | 7.157 | 7.346 | 7.422 | 5.556 | 6.981 |
| 04/11/2017 | 6.574 | 5.662 | 5.125 | 7.159 | 7.237 | 7.364 | 5.581 | 7.008 |
| 05/11/2017 | 6.641 | 5.77 | 5.118 | 7.169 | 7.278 | 7.662 | 5.408 | 7.098 |
| 06/11/2017 | 6.594 | 5.554 | 5.071 | 7.172 | 7.244 | 7.549 | 5.4 | 7.11 |
| 07/11/2017 | 6.547 | 5.614 | 5.117 | 7.237 | 7.258 | 7.604 | 5.381 | 7.132 |
| 08/11/2017 | 6.63 | 5.549 | 5.083 | 7.272 | 7.318 | 7.565 | 5.505 | 7.117 |
| 09/11/2017 | 6.581 | 5.588 | 5.063 | 7.304 | 7.225 | 7.601 | 5.561 | 7.197 |
| 10/11/2017 | 6.544 | 5.503 | 5.069 | 7.275 | 7.349 | 7.594 | 5.508 | 7.148 |
| 11/11/2017 | 6.524 | 5.556 | 5.043 | 7.256 | 7.362 | 7.483 | 5.57 | 7.173 |
| 12/11/2017 | 6.586 | 5.648 | 5.071 | 7.216 | 7.447 | 7.523 | 5.524 | 7.157 |
| 13/11/2017 | 6.685 | 5.695 | 5.133 | 7.228 | 7.401 | 7.707 | 5.758 | 7.133 |
| 14/11/2017 | 6.635 | 5.674 | 5.06 | 7.242 | 7.366 | 7.581 | 6.18 | 7.178 |
| 15/11/2017 | 6.647 | 5.56 | 5.01 | 7.271 | 7.297 | 7.47 | 6.131 | 7.312 |
| 16/11/2017 | 6.631 | 5.704 | 5.052 | 7.299 | 7.266 | 7.505 | 5.996 | 7.337 |
| 17/11/2017 | 6.598 | 5.699 | 5.041 | 7.279 | 7.315 | 7.457 | 5.95 | 7.284 |
| 18/11/2017 | 6.622 | 5.692 | 5.05 | 7.266 | 7.299 | 7.587 | 5.947 | 7.281 |
| 19/11/2017 | 6.611 | 5.599 | 5.044 | 7.26 | 7.249 | 7.577 | 5.906 | 7.256 |
| 20/11/2017 | 6.638 | 5.623 | 5.133 | 7.248 | 7.268 | 7.336 | 5.942 | 7.321 |
| 21/11/2017 | 6.682 | 5.657 | 5.138 | 7.248 | 7.261 | 7.319 | 5.922 | 7.323 |
| 22/11/2017 | 6.633 | 5.909 | 5.152 | 7.3 | 7.336 | 7.415 | 6.041 | 7.277 |
| 23/11/2017 | 6.575 | 5.717 | 5.179 | 7.242 | 7.325 | 7.28 | 5.966 | 7.245 |
| 24/11/2017 | 6.607 | 5.59 | 5.104 | 7.204 | 7.384 | 7.367 | 6.2 | 7.199 |
| 25/11/2017 | 6.564 | 5.682 | 5.115 | 7.19 | 7.186 | 7.224 | 6.161 | 7.182 |
| 26/11/2017 | 6.539 | 5.658 | 5.085 | 7.24 | 7.302 | 7.163 | 6.277 | 7.199 |
| 27/11/2017 | 6.505 | 5.622 | 5.099 | 7.286 | 7.343 | 7.224 | 6.191 | 7.182 |
| 28/11/2017 | 6.507 | 5.612 | 5.094 | 7.261 | 7.343 | 7.224 | 6.284 | 7.253 |
| 29/11/2017 | 6.504 | 5.637 | 4.996 | 7.213 | 7.343 | 7.224 | 6.177 | 7.303 |
| 30/11/2017 | 6.676 | 5.528 | 4.999 | 7.275 | 7.323 | 7.155 | 6.193 | 7.382 |
| 01/12/2017 | 6.677 | 5.529 | 5.051 | 7.36 | 7.327 | 7.167 | 6.293 | 7.417 |
| 02/12/2017 | 6.677 | 5.528 | 5.158 | 7.306 | 7.323 | 7.167 | 6.628 | 7.46 |
| 03/12/2017 | 6.678 | 5.528 | 5.112 | 7.353 | 7.335 | 7.161 | 6.561 | 7.451 |
| 04/12/2017 | 6.676 | 5.523 | 5.114 | 7.329 | 7.323 | 7.161 | 6.475 | 7.469 |
| 05/12/2017 | 6.676 | 5.528 | 5.112 | 7.322 | 7.323 | 7.161 | 6.354 | 7.463 |
| 06/12/2017 | 6.583 | 5.677 | 4.994 | 7.328 | 7.48 | 7.302 | 5.815 | 7.432 |
| 07/12/2017 | 6.609 | 5.678 | 5.126 | 7.312 | 7.425 | 7.338 | 5.908 | 7.403 |
| 08/12/2017 | 6.499 | 5.655 | 5.062 | 7.286 | 7.435 | 7.47 | 5.907 | 7.31 |
| 09/12/2017 | 6.544 | 5.739 | 5.063 | 7.274 | 7.435 | 7.232 | 5.896 | 7.29 |
| 10/12/2017 | 6.671 | 5.739 | 5.094 | 7.246 | 7.477 | 7.227 | 5.963 | 7.31 |
| 11/12/2017 | 6.626 | 5.689 | 5.133 | 7.233 | 7.442 | 7.252 | 6.313 | 7.318 |
| 12/12/2017 | 6.612 | 5.701 | 5.156 | 7.253 | 7.432 | 7.307 | 6.201 | 7.299 |
| 13/12/2017 | 6.63 | 5.826 | 5.098 | 7.308 | 7.396 | 7.178 | 6.203 | 7.33 |
| 14/12/2017 | 6.647 | 5.669 | 5.147 | 7.273 | 7.392 | 7.233 | 5.403 | 7.299 |
| 15/12/2017 | 6.676 | 5.72 | 5.16 | 7.281 | 7.423 | 7.281 | 5.483 | 7.25 |
| 16/12/2017 | 6.613 | 5.806 | 5.131 | 7.356 | 7.364 | 7.167 | 5.568 | 7.304 |
| 17/12/2017 | 6.602 | 5.664 | 5.11 | 7.317 | 7.491 | 7.193 | 5.463 | 7.333 |
| 18/12/2017 | 6.592 | 5.635 | 5.108 | 7.327 | 7.419 | 7.092 | 5.523 | 7.401 |
| 19/12/2017 | 6.613 | 5.574 | 5.094 | 7.321 | 7.373 | 7.08 | 5.467 | 7.366 |
| 20/12/2017 | 6.631 | 5.686 | 5.094 | 7.317 | 7.409 | 7.251 | 5.406 | 7.353 |
| 21/12/2017 | 6.666 | 5.618 | 5.087 | 7.333 | 7.405 | 7.302 | 5.434 | 7.34 |
| 22/12/2017 | 6.63 | 5.728 | 5.08 | 7.31 | 7.38 | 7.242 | 5.523 | 7.288 |
| 23/12/2017 | 6.608 | 5.734 | 5.1 | 7.292 | 7.408 | 7.242 | 5.518 | 7.272 |
| 24/12/2017 | 6.616 | 5.798 | 5.07 | 7.294 | 7.348 | 7.216 | 5.684 | 7.317 |
| 25/12/2017 | 6.491 | 5.668 | 5.049 | 7.3 | 7.441 | 7.044 | 5.474 | 7.346 |
| 26/12/2017 | 6.592 | 5.677 | 5.078 | 7.263 | 7.368 | 7.183 | 5.407 | 7.346 |
| 27/12/2017 | 6.614 | 5.679 | 5.087 | 7.299 | 7.359 | 7.111 | 5.456 | 7.34 |
| 28/12/2017 | 6.6 | 5.714 | 5.084 | 7.278 | 7.495 | 7.251 | 5.425 | 7.275 |
| 29/12/2017 | 6.57 | 5.843 | 5.142 | 7.258 | 7.388 | 7.13 | 5.55 | 7.274 |
| 30/12/2017 | 6.606 | 5.857 | 5.116 | 7.221 | 7.345 | 7.162 | 5.472 | 7.249 |
| 31/12/2017 | 6.66 | 5.843 | 5.144 | 7.286 | 7.349 | 7.31 | 5.547 | 7.238 |
| 01/01/2018 | 6.613 | 5.833 | 5.134 | 7.285 | 7.344 | 7.283 | 5.588 | 7.264 |
| 02/01/2018 | 6.545 | 5.805 | 5.124 | 7.247 | 7.331 | 7.127 | 5.669 | 7.3 |
| 03/01/2018 | 6.594 | 5.722 | 5.069 | 7.225 | 7.348 | 7.172 | 5.622 | 7.233 |
| 04/01/2018 | 6.544 | 5.775 | 5.116 | 7.199 | 7.301 | 7.363 | 5.54 | 7.242 |
| 05/01/2018 | 6.521 | 5.732 | 5.162 | 7.233 | 7.345 | 7.162 | 5.494 | 7.234 |
| 06/01/2018 | 6.546 | 5.604 | 5.03 | 7.248 | 7.389 | 7.173 | 5.512 | 7.295 |
| 07/01/2018 | 6.556 | 5.565 | 5.024 | 7.327 | 7.438 | 7.288 | 5.549 | 7.285 |
| 08/01/2018 | 6.531 | 5.662 | 5.063 | 7.323 | 7.485 | 7.182 | 5.482 | 7.395 |
| 09/01/2018 | 6.483 | 5.581 | 5.025 | 7.322 | 7.585 | 7.045 | 5.451 | 7.442 |
| 10/01/2018 | 6.599 | 5.733 | 5.069 | 7.279 | 7.517 | 7.228 | 5.516 | 7.393 |
| 11/01/2018 | 6.59 | 5.772 | 5.116 | 7.295 | 7.573 | 7.275 | 5.523 | 7.434 |
| 12/01/2018 | 6.514 | 5.704 | 5.098 | 7.318 | 7.467 | 7.224 | 5.458 | 7.425 |
| 13/01/2018 | 6.584 | 5.587 | 5.049 | 7.3 | 7.582 | 7.099 | 5.421 | 7.332 |
| 14/01/2018 | 6.612 | 5.718 | 5.108 | 7.311 | 7.542 | 7.169 | 5.534 | 7.315 |
| 15/01/2018 | 6.587 | 5.709 | 5.087 | 7.324 | 7.588 | 7.398 | 5.566 | 7.337 |
| 16/01/2018 | 6.658 | 5.644 | 5.01 | 7.275 | 7.482 | 7.176 | 5.458 | 7.395 |
| 17/01/2018 | 6.641 | 5.745 | 5.011 | 7.262 | 7.408 | 7.12 | 5.466 | 7.341 |
| 18/01/2018 | 6.641 | 5.671 | 5.041 | 7.264 | 7.438 | 7.277 | 5.518 | 7.348 |
| 19/01/2018 | 6.641 | 5.695 | 5.06 | 7.252 | 7.441 | 7.033 | 5.484 | 7.312 |
| 20/01/2018 | 6.63 | 5.736 | 5.01 | 7.243 | 7.46 | 7.07 | 5.516 | 7.313 |
| 21/01/2018 | 6.61 | 5.747 | 5.027 | 7.237 | 7.419 | 7.344 | 5.491 | 7.318 |
| 22/01/2018 | 6.548 | 5.75 | 5.028 | 7.236 | 7.297 | 7.262 | 5.523 | 7.306 |
| 23/01/2018 | 6.537 | 5.704 | 5.003 | 7.267 | 7.326 | 7.14 | 5.538 | 7.287 |
| 24/01/2018 | 6.617 | 5.653 | 5.026 | 7.26 | 7.363 | 7.118 | 5.517 | 7.3 |
| 25/01/2018 | 6.553 | 5.65 | 5.006 | 7.25 | 7.297 | 7.188 | 5.578 | 7.263 |
| 26/01/2018 | 6.64 | 5.69 | 5.022 | 7.251 | 7.377 | 7.032 | 5.539 | 7.276 |
| 27/01/2018 | 6.602 | 5.653 | 5.101 | 7.266 | 7.397 | 7.178 | 5.609 | 7.28 |
| 28/01/2018 | 6.633 | 5.581 | 5.07 | 7.281 | 7.317 | 7.028 | 5.644 | 7.297 |
| 29/01/2018 | 6.676 | 5.616 | 5.117 | 7.275 | 7.356 | 7.138 | 5.431 | 7.325 |
| 30/01/2018 | 6.695 | 5.675 | 5.004 | 7.266 | 7.41 | 7.174 | 5.508 | 7.295 |
| 31/01/2018 | 6.682 | 5.731 | 5.066 | 7.26 | 7.326 | 7.079 | 5.418 | 7.285 |
| 01/02/2018 | 6.607 | 5.65 | 5.042 | 7.249 | 7.423 | 7.027 | 5.426 | 7.308 |
| 02/02/2018 | 6.702 | 5.825 | 5.024 | 7.287 | 7.447 | 7.163 | 5.495 | 7.331 |
| 03/02/2018 | 6.672 | 5.681 | 5.091 | 7.322 | 7.45 | 7.104 | 5.526 | 7.354 |
| 04/02/2018 | 6.513 | 5.644 | 5.061 | 7.313 | 7.501 | 7.146 | 5.464 | 7.352 |
| 05/02/2018 | 6.61 | 5.649 | 5.019 | 7.329 | 7.503 | 7.159 | 5.529 | 7.396 |
| 06/02/2018 | 6.671 | 5.691 | 5.101 | 7.33 | 7.451 | 7.234 | 5.42 | 7.345 |
| 07/02/2018 | 6.69 | 5.717 | 5.035 | 7.344 | 7.472 | 7.184 | 5.426 | 7.41 |
| 08/02/2018 | 6.747 | 5.737 | 5.085 | 7.338 | 7.598 | 7.121 | 5.416 | 7.333 |
| 09/02/2018 | 6.709 | 5.777 | 5.038 | 7.333 | 7.591 | 7.045 | 5.416 | 7.363 |
| 10/02/2018 | 6.643 | 5.695 | 5.14 | 7.331 | 7.212 | 7.161 | 5.447 | 7.324 |
| 11/02/2018 | 6.566 | 5.788 | 5.056 | 7.312 | 7.521 | 7.2 | 5.47 | 7.259 |
| 12/02/2018 | 6.669 | 5.706 | 5.123 | 7.311 | 7.509 | 7.069 | 5.457 | 7.222 |
| 13/02/2018 | 6.669 | 5.826 | 5.091 | 7.339 | 7.52 | 7.225 | 5.452 | 7.257 |
| 14/02/2018 | 6.666 | 5.766 | 5.033 | 7.296 | 7.418 | 7.218 | 5.475 | 7.251 |
| 15/02/2018 | 6.618 | 5.82 | 5.085 | 7.301 | 7.421 | 7.211 | 5.686 | 7.245 |
| 16/02/2018 | 6.644 | 5.82 | 5.075 | 7.262 | 7.339 | 7.105 | 5.65 | 7.249 |
| 17/02/2018 | 6.657 | 5.753 | 5.033 | 7.259 | 7.328 | 7.219 | 5.665 | 7.211 |
| 18/02/2018 | 6.551 | 5.694 | 5.052 | 7.273 | 7.371 | 7.139 | 5.707 | 7.204 |
| 19/02/2018 | 6.636 | 5.632 | 5.003 | 7.27 | 7.347 | 7.137 | 5.677 | 7.207 |
| 20/02/2018 | 6.64 | 5.658 | 5.052 | 7.297 | 7.335 | 7.153 | 5.726 | 7.214 |
| 21/02/2018 | 6.673 | 5.596 | 5.1 | 7.325 | 7.358 | 7.169 | 5.71 | 7.251 |
| 22/02/2018 | 6.759 | 5.682 | 5.125 | 7.353 | 7.488 | 7.131 | 5.76 | 7.275 |
| 23/02/2018 | 6.756 | 5.667 | 5.105 | 7.341 | 7.396 | 7.1 | 5.701 | 7.316 |
| 24/02/2018 | 6.709 | 5.688 | 5.086 | 7.351 | 7.429 | 7.047 | 5.673 | 7.359 |
| 25/02/2018 | 6.631 | 5.725 | 5.107 | 7.343 | 7.407 | 7.209 | 5.665 | 7.35 |
| 26/02/2018 | 6.76 | 5.721 | 5.108 | 7.379 | 7.427 | 7.105 | 5.776 | 7.34 |
| 27/02/2018 | 6.586 | 5.468 | 5.1 | 7.339 | 7.4 | 6.975 | 5.788 | 7.347 |
| 28/02/2018 | 6.696 | 5.563 | 5.065 | 7.372 | 7.488 | 6.944 | 5.701 | 7.301 |
| 01/03/2018 | 6.671 | 5.814 | 5.095 | 7.372 | 7.451 | 7.051 | 5.778 | 7.283 |
| 02/03/2018 | 6.559 | 5.601 | 5.122 | 7.334 | 7.513 | 7.05 | 5.795 | 7.286 |
| 03/03/2018 | 6.628 | 5.576 | 5.165 | 7.271 | 7.395 | 7.06 | 5.697 | 7.285 |
| 04/03/2018 | 6.601 | 5.625 | 5.142 | 7.311 | 7.417 | 7.091 | 5.715 | 7.254 |
| 05/03/2018 | 6.681 | 5.673 | 5.144 | 7.304 | 7.473 | 7.022 | 5.736 | 7.276 |
| 06/03/2018 | 6.563 | 5.687 | 5.096 | 7.316 | 7.42 | 7.13 | 5.775 | 7.342 |
| 07/03/2018 | 6.695 | 5.647 | 5.123 | 7.349 | 7.424 | 7.1 | 5.81 | 7.276 |
| 08/03/2018 | 6.618 | 5.67 | 5.173 | 7.322 | 7.478 | 7.058 | 5.719 | 7.259 |
| 09/03/2018 | 6.646 | 5.718 | 5.153 | 7.306 | 7.431 | 7.08 | 5.77 | 7.244 |
| 10/03/2018 | 6.725 | 5.653 | 5.133 | 7.259 | 7.467 | 7.133 | 5.731 | 7.226 |
| 11/03/2018 | 6.791 | 5.79 | 5.171 | 7.259 | 7.386 | 7.17 | 5.814 | 7.24 |
| 12/03/2018 | 6.705 | 5.694 | 5.136 | 7.299 | 7.354 | 7.266 | 5.803 | 7.27 |
| 13/03/2018 | 6.618 | 5.655 | 5.079 | 7.278 | 7.437 | 7.178 | 5.79 | 7.239 |
| 14/03/2018 | 6.701 | 5.696 | 5.12 | 7.275 | 7.374 | 7.106 | 5.725 | 7.2 |
| 15/03/2018 | 6.712 | 5.67 | 5.136 | 7.277 | 7.377 | 7.413 | 5.753 | 7.222 |
| 16/03/2018 | 6.682 | 5.607 | 5.152 | 7.28 | 7.378 | 7.075 | 5.827 | 7.245 |
| 17/03/2018 | 6.646 | 5.611 | 5.084 | 7.302 | 7.362 | 7.05 | 5.772 | 7.275 |
| 18/03/2018 | 6.721 | 5.666 | 5.098 | 7.277 | 7.378 | 7.101 | 5.735 | 7.276 |
| 19/03/2018 | 6.806 | 5.684 | 5.092 | 7.317 | 7.355 | 7.212 | 5.755 | 7.294 |
| 20/03/2018 | 6.893 | 5.746 | 5.149 | 7.311 | 7.424 | 7.044 | 5.809 | 7.366 |
| 21/03/2018 | 6.927 | 5.773 | 5.176 | 7.326 | 7.358 | 7.262 | 5.711 | 7.368 |
| 22/03/2018 | 6.748 | 5.827 | 5.215 | 7.35 | 7.316 | 7.154 | 5.817 | 7.361 |
| 23/03/2018 | 6.708 | 5.61 | 5.224 | 7.305 | 7.428 | 7.17 | 5.736 | 7.355 |
| 24/03/2018 | 6.912 | 5.77 | 5.18 | 7.29 | 7.373 | 7.113 | 5.795 | 7.276 |
| 25/03/2018 | 6.785 | 5.77 | 5.147 | 7.281 | 7.335 | 7.137 | 5.803 | 7.298 |
| 26/03/2018 | 6.815 | 5.747 | 5.199 | 7.284 | 7.44 | 7.141 | 5.786 | 7.322 |
| 27/03/2018 | 6.729 | 5.75 | 5.19 | 7.26 | 7.39 | 7.245 | 5.808 | 7.291 |
| 28/03/2018 | 6.673 | 5.949 | 5.239 | 7.212 | 7.375 | 7.295 | 5.929 | 7.251 |
| 29/03/2018 | 6.633 | 5.881 | 5.19 | 7.292 | 7.346 | 7.172 | 5.971 | 7.281 |
| 30/03/2018 | 6.697 | 5.729 | 5.202 | 7.293 | 7.357 | 7.099 | 5.859 | 7.319 |
| 31/03/2018 | 6.712 | 5.785 | 5.185 | 7.28 | 7.424 | 7.318 | 5.818 | 7.362 |
| 01/04/2018 | 6.691 | 5.754 | 5.181 | 7.282 | 7.404 | 7.145 | 5.819 | 7.325 |
| 02/04/2018 | 6.725 | 5.673 | 5.143 | 7.263 | 7.388 | 7.046 | 5.771 | 7.304 |
| 03/04/2018 | 6.842 | 5.715 | 5.23 | 7.247 | 7.336 | 7.244 | 5.904 | 7.203 |
| 04/04/2018 | 6.736 | 5.71 | 5.193 | 7.234 | 7.367 | 7.236 | 5.799 | 7.292 |
| 05/04/2018 | 6.733 | 5.645 | 5.149 | 7.213 | 7.359 | 7.184 | 5.82 | 7.275 |
| 06/04/2018 | 6.744 | 5.667 | 5.136 | 7.252 | 7.456 | 7.097 | 5.846 | 7.29 |
| 07/04/2018 | 6.644 | 5.54 | 5.188 | 7.263 | 7.33 | 6.998 | 5.889 | 7.243 |
| 08/04/2018 | 6.667 | 5.642 | 5.13 | 7.274 | 7.383 | 7.16 | 5.813 | 7.301 |
| 09/04/2018 | 6.718 | 5.606 | 5.214 | 7.296 | 7.388 | 7.173 | 5.779 | 7.295 |
| 10/04/2018 | 6.526 | 5.503 | 5.144 | 7.299 | 7.442 | 6.974 | 5.736 | 7.288 |
| 11/04/2018 | 6.633 | 5.718 | 5.186 | 7.31 | 7.501 | 6.978 | 5.656 | 7.397 |
| 12/04/2018 | 6.618 | 5.538 | 5.178 | 7.313 | 7.45 | 7.019 | 5.758 | 7.295 |
| 13/04/2018 | 6.682 | 5.603 | 5.158 | 7.235 | 7.395 | 7.129 | 5.795 | 7.258 |
| 14/04/2018 | 6.585 | 5.721 | 5.219 | 7.263 | 7.466 | 7.21 | 5.789 | 7.247 |
| 15/04/2018 | 6.549 | 5.763 | 5.155 | 7.209 | 7.39 | 7.118 | 5.803 | 7.208 |
| 16/04/2018 | 6.576 | 5.694 | 5.185 | 7.232 | 7.345 | 7.101 | 5.763 | 7.243 |
| 17/04/2018 | 6.519 | 5.695 | 5.177 | 7.229 | 7.426 | 7.269 | 5.963 | 7.213 |
| 18/04/2018 | 6.635 | 5.86 | 5.236 | 7.228 | 7.36 | 7.213 | 5.945 | 7.193 |
| 19/04/2018 | 6.655 | 5.808 | 5.27 | 7.212 | 7.38 | 7.257 | 6.003 | 7.195 |
| 20/04/2018 | 6.703 | 5.861 | 5.238 | 7.204 | 7.397 | 7.225 | 6.01 | 7.168 |
| 21/04/2018 | 6.608 | 5.718 | 5.296 | 7.203 | 7.379 | 7.208 | 5.908 | 7.187 |
| 22/04/2018 | 6.625 | 5.877 | 5.294 | 7.154 | 7.314 | 7.235 | 5.997 | 7.138 |
| 23/04/2018 | 6.691 | 5.883 | 5.288 | 7.203 | 7.31 | 7.305 | 6.004 | 7.142 |
| 24/04/2018 | 6.603 | 5.903 | 5.285 | 7.187 | 7.351 | 7.326 | 6.181 | 7.133 |
| 25/04/2018 | 6.547 | 5.831 | 5.287 | 7.19 | 7.367 | 7.259 | 5.99 | 7.127 |
| 26/04/2018 | 6.557 | 5.825 | 5.297 | 7.194 | 7.371 | 7.397 | 5.981 | 7.15 |
| 27/04/2018 | 6.584 | 5.85 | 5.334 | 7.197 | 7.409 | 7.263 | 5.975 | 7.093 |
| 28/04/2018 | 6.687 | 5.733 | 5.311 | 7.215 | 7.415 | 7.188 | 6.039 | 7.108 |
| 29/04/2018 | 6.661 | 5.922 | 5.279 | 7.276 | 7.356 | 7.375 | 6.049 | 7.252 |
| 30/04/2018 | 6.525 | 5.759 | 5.289 | 7.266 | 7.361 | 7.228 | 5.975 | 7.244 |
| 01/05/2018 | 6.615 | 5.763 | 5.308 | 7.315 | 7.413 | 7.083 | 6.054 | 7.283 |
| 02/05/2018 | 6.54 | 6.072 | 5.403 | 7.285 | 7.389 | 7.195 | 6.036 | 7.341 |
| 03/05/2018 | 6.617 | 5.816 | 5.325 | 7.28 | 7.337 | 7.113 | 6.098 | 7.208 |
| 04/05/2018 | 6.548 | 5.678 | 5.34 | 7.27 | 7.376 | 7.329 | 5.935 | 7.173 |
| 05/05/2018 | 6.532 | 5.754 | 5.318 | 7.237 | 7.384 | 7.23 | 6.052 | 7.089 |
| 06/05/2018 | 6.578 | 5.813 | 5.31 | 7.229 | 7.415 | 7.255 | 6.01 | 7.171 |